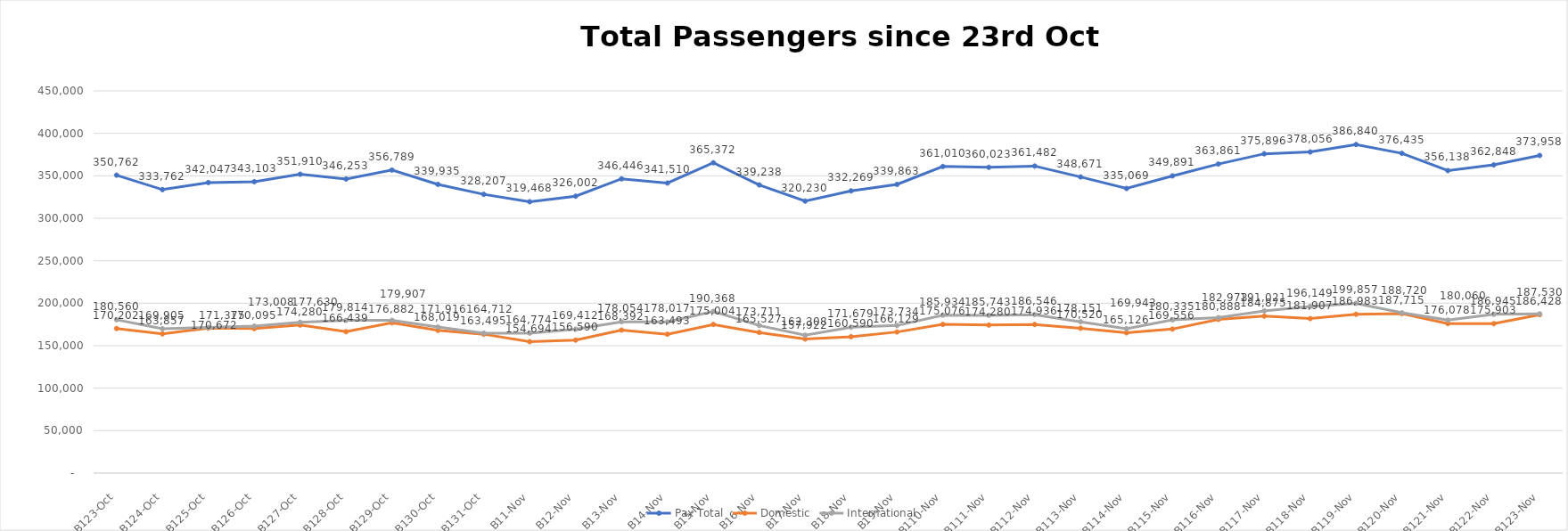
| Category | Pax Total | Domestic | International |
|---|---|---|---|
| 2023-10-23 | 350762 | 170202 | 180560 |
| 2023-10-24 | 333762 | 163857 | 169905 |
| 2023-10-25 | 342047 | 170672 | 171375 |
| 2023-10-26 | 343103 | 170095 | 173008 |
| 2023-10-27 | 351910 | 174280 | 177630 |
| 2023-10-28 | 346253 | 166439 | 179814 |
| 2023-10-29 | 356789 | 176882 | 179907 |
| 2023-10-30 | 339935 | 168019 | 171916 |
| 2023-10-31 | 328207 | 163495 | 164712 |
| 2023-11-01 | 319468 | 154694 | 164774 |
| 2023-11-02 | 326002 | 156590 | 169412 |
| 2023-11-03 | 346446 | 168392 | 178054 |
| 2023-11-04 | 341510 | 163493 | 178017 |
| 2023-11-05 | 365372 | 175004 | 190368 |
| 2023-11-06 | 339238 | 165527 | 173711 |
| 2023-11-07 | 320230 | 157922 | 162308 |
| 2023-11-08 | 332269 | 160590 | 171679 |
| 2023-11-09 | 339863 | 166129 | 173734 |
| 2023-11-10 | 361010 | 175076 | 185934 |
| 2023-11-11 | 360023 | 174280 | 185743 |
| 2023-11-12 | 361482 | 174936 | 186546 |
| 2023-11-13 | 348671 | 170520 | 178151 |
| 2023-11-14 | 335069 | 165126 | 169943 |
| 2023-11-15 | 349891 | 169556 | 180335 |
| 2023-11-16 | 363861 | 180888 | 182973 |
| 2023-11-17 | 375896 | 184875 | 191021 |
| 2023-11-18 | 378056 | 181907 | 196149 |
| 2023-11-19 | 386840 | 186983 | 199857 |
| 2023-11-20 | 376435 | 187715 | 188720 |
| 2023-11-21 | 356138 | 176078 | 180060 |
| 2023-11-22 | 362848 | 175903 | 186945 |
| 2023-11-23 | 373958 | 186428 | 187530 |